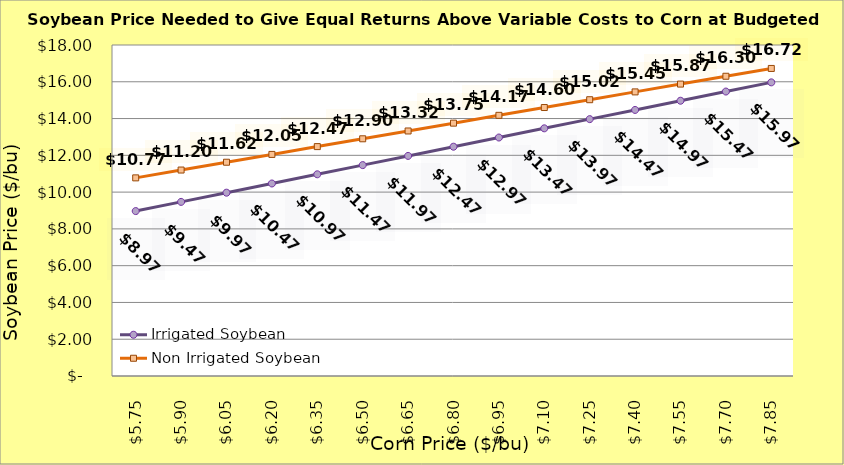
| Category | Irrigated Soybean | Non Irrigated Soybean |
|---|---|---|
| 5.749999999999997 | 8.969 | 10.775 |
| 5.899999999999998 | 9.469 | 11.2 |
| 6.049999999999998 | 9.969 | 11.625 |
| 6.199999999999998 | 10.469 | 12.05 |
| 6.349999999999999 | 10.969 | 12.475 |
| 6.499999999999999 | 11.469 | 12.9 |
| 6.6499999999999995 | 11.969 | 13.325 |
| 6.8 | 12.469 | 13.75 |
| 6.95 | 12.969 | 14.175 |
| 7.1000000000000005 | 13.469 | 14.6 |
| 7.250000000000001 | 13.969 | 15.025 |
| 7.400000000000001 | 14.469 | 15.45 |
| 7.550000000000002 | 14.969 | 15.875 |
| 7.700000000000002 | 15.469 | 16.3 |
| 7.850000000000002 | 15.969 | 16.725 |